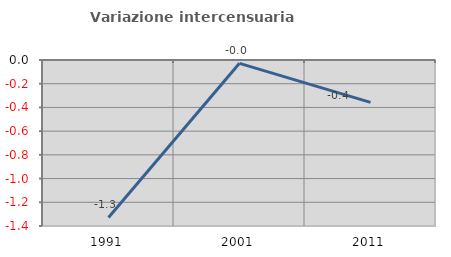
| Category | Variazione intercensuaria annua |
|---|---|
| 1991.0 | -1.328 |
| 2001.0 | -0.028 |
| 2011.0 | -0.357 |